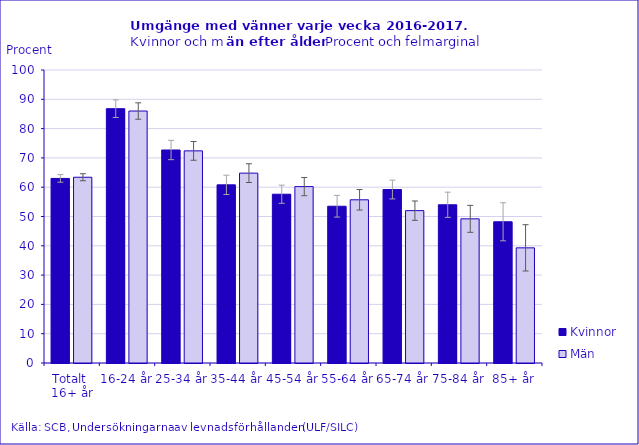
| Category | Kvinnor | Män |
|---|---|---|
| Totalt 
16+ år | 63 | 63.4 |
| 16-24 år | 86.8 | 86 |
| 25-34 år | 72.7 | 72.4 |
| 35-44 år | 60.8 | 64.8 |
| 45-54 år | 57.6 | 60.2 |
| 55-64 år | 53.5 | 55.7 |
| 65-74 år | 59.2 | 52 |
| 75-84 år | 54 | 49.2 |
| 85+ år | 48.2 | 39.3 |